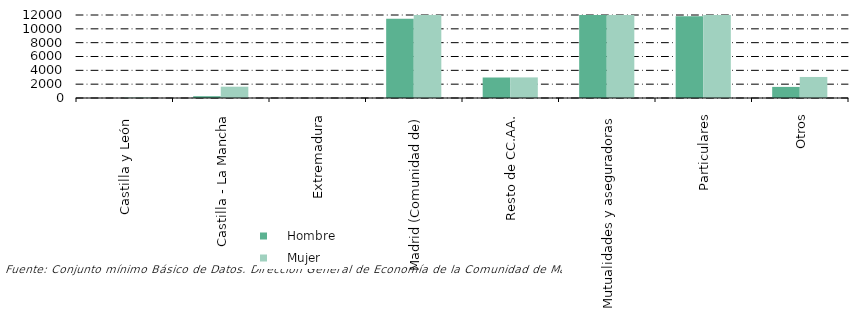
| Category |     Hombre |     Mujer |
|---|---|---|
| Castilla y León  | 2 | 75 |
| Castilla - La Mancha | 258 | 1633 |
| Extremadura | 2 | 1 |
| Madrid (Comunidad de) | 11442 | 16698 |
| Resto de CC.AA. | 2964 | 2978 |
| Mutualidades y aseguradoras | 71471 | 86995 |
| Particulares | 11832 | 18682 |
| Otros | 1604 | 3041 |